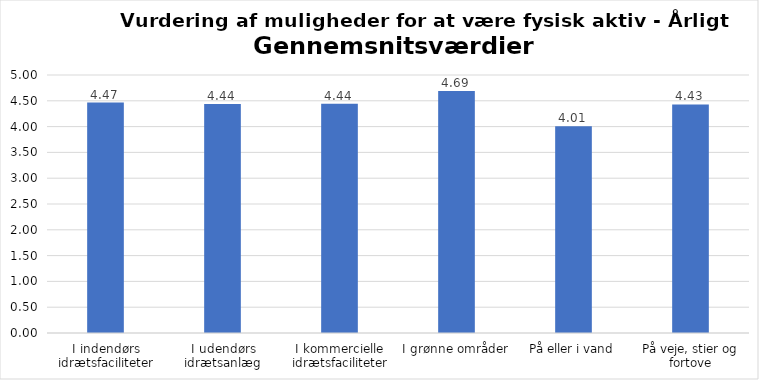
| Category | Gennemsnit |
|---|---|
| I indendørs idrætsfaciliteter | 4.467 |
| I udendørs idrætsanlæg | 4.438 |
| I kommercielle idrætsfaciliteter | 4.443 |
| I grønne områder | 4.689 |
| På eller i vand | 4.008 |
| På veje, stier og fortove | 4.43 |